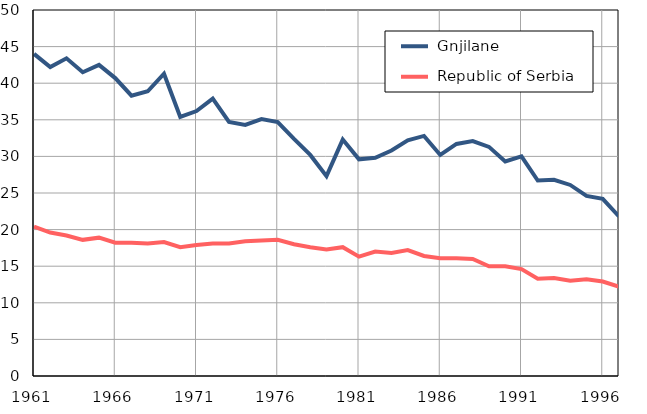
| Category |  Gnjilane |  Republic of Serbia |
|---|---|---|
| 1961.0 | 44 | 20.4 |
| 1962.0 | 42.2 | 19.6 |
| 1963.0 | 43.4 | 19.2 |
| 1964.0 | 41.5 | 18.6 |
| 1965.0 | 42.5 | 18.9 |
| 1966.0 | 40.7 | 18.2 |
| 1967.0 | 38.3 | 18.2 |
| 1968.0 | 38.9 | 18.1 |
| 1969.0 | 41.3 | 18.3 |
| 1970.0 | 35.4 | 17.6 |
| 1971.0 | 36.2 | 17.9 |
| 1972.0 | 37.9 | 18.1 |
| 1973.0 | 34.7 | 18.1 |
| 1974.0 | 34.3 | 18.4 |
| 1975.0 | 35.1 | 18.5 |
| 1976.0 | 34.7 | 18.6 |
| 1977.0 | 32.4 | 18 |
| 1978.0 | 30.2 | 17.6 |
| 1979.0 | 27.3 | 17.3 |
| 1980.0 | 32.3 | 17.6 |
| 1981.0 | 29.6 | 16.3 |
| 1982.0 | 29.8 | 17 |
| 1983.0 | 30.8 | 16.8 |
| 1984.0 | 32.2 | 17.2 |
| 1985.0 | 32.8 | 16.4 |
| 1986.0 | 30.2 | 16.1 |
| 1987.0 | 31.7 | 16.1 |
| 1988.0 | 32.1 | 16 |
| 1989.0 | 31.3 | 15 |
| 1990.0 | 29.3 | 15 |
| 1991.0 | 30 | 14.6 |
| 1992.0 | 26.7 | 13.3 |
| 1993.0 | 26.8 | 13.4 |
| 1994.0 | 26.1 | 13 |
| 1995.0 | 24.6 | 13.2 |
| 1996.0 | 24.2 | 12.9 |
| 1997.0 | 21.8 | 12.2 |